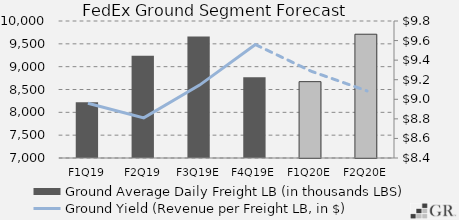
| Category | Ground Average Daily Freight LB (in thousands LBS) |
|---|---|
|  F1Q19  | 8221 |
|  F2Q19  | 9237 |
|  F3Q19E  | 9660.613 |
|  F4Q19E  | 8766.656 |
|  F1Q20E  | 8671.937 |
|  F2Q20E  | 9710.365 |